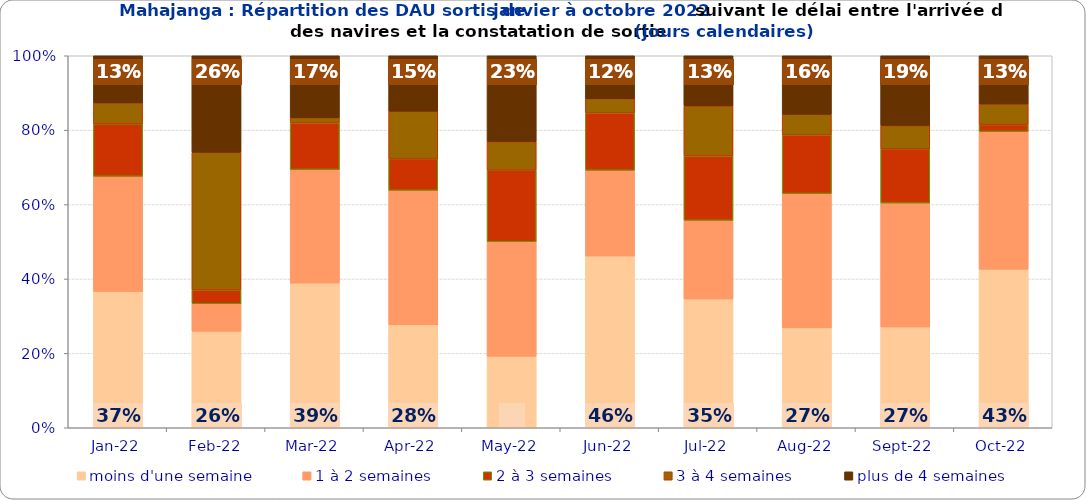
| Category | moins d'une semaine | 1 à 2 semaines | 2 à 3 semaines | 3 à 4 semaines | plus de 4 semaines |
|---|---|---|---|---|---|
| 2022-01-01 | 0.366 | 0.31 | 0.141 | 0.056 | 0.127 |
| 2022-02-01 | 0.259 | 0.074 | 0.037 | 0.37 | 0.259 |
| 2022-03-01 | 0.389 | 0.306 | 0.125 | 0.014 | 0.167 |
| 2022-04-01 | 0.277 | 0.362 | 0.085 | 0.128 | 0.149 |
| 2022-05-01 | 0.192 | 0.308 | 0.192 | 0.077 | 0.231 |
| 2022-06-01 | 0.462 | 0.231 | 0.154 | 0.038 | 0.115 |
| 2022-07-01 | 0.346 | 0.212 | 0.173 | 0.135 | 0.135 |
| 2022-08-01 | 0.269 | 0.361 | 0.157 | 0.056 | 0.157 |
| 2022-09-01 | 0.271 | 0.333 | 0.146 | 0.062 | 0.188 |
| 2022-10-01 | 0.426 | 0.37 | 0.019 | 0.056 | 0.13 |